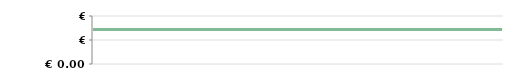
| Category | ANNO   |
|---|---|
| 2013-04-23 | 143800 |
| 2013-04-25 | 143800 |
| 2013-05-07 | 143800 |
| 2013-05-14 | 143800 |
| 2013-05-14 | 143800 |
| 2013-05-29 | 143800 |
| 2013-06-10 | 143800 |
| 2013-06-21 | 143800 |
| 2013-07-06 | 143800 |
| 2013-08-05 | 143800 |
| 2013-08-19 | 143800 |
| 2013-09-04 | 143800 |
| 2013-09-20 | 143800 |
| 2013-09-25 | 143800 |
| 2013-10-15 | 143800 |
| 2013-11-05 | 143800 |
| 2013-11-26 | 143800 |
| 2013-11-30 | 143800 |
| 2013-12-11 | 143800 |